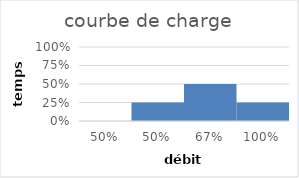
| Category | Series 0 |
|---|---|
| 0.5 | 0 |
| 0.5 | 0.25 |
| 0.67 | 0.5 |
| 1.0 | 0.25 |